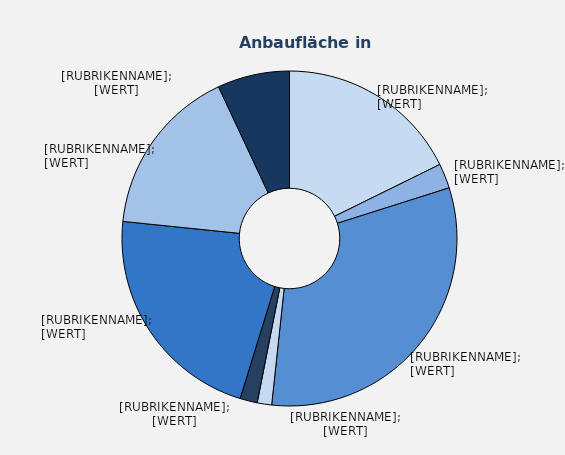
| Category | Series 1 |
|---|---|
| Feldsalat | 6.36 |
| Kopfsalat | 0.86 |
| sonstige Salate | 11.34 |
| Paprika | 0.5 |
| Radies | 0.6 |
| Salatgurken | 7.85 |
| Tomaten | 5.89 |
| sonstige Gemüsearten | 2.5 |